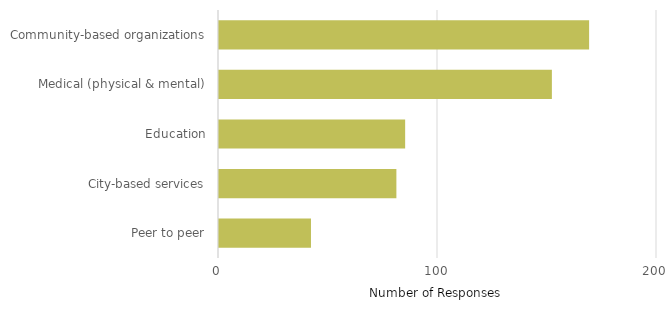
| Category | Series 0 |
|---|---|
| Peer to peer | 42 |
| City-based services | 81 |
| Education | 85 |
| Medical (physical & mental) | 152 |
| Community-based organizations | 169 |